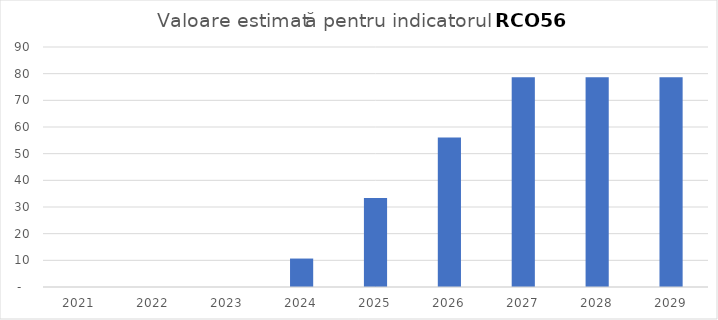
| Category | Series 0 |
|---|---|
| 2021.0 | 0 |
| 2022.0 | 0 |
| 2023.0 | 0 |
| 2024.0 | 10.67 |
| 2025.0 | 33.343 |
| 2026.0 | 56.017 |
| 2027.0 | 78.69 |
| 2028.0 | 78.69 |
| 2029.0 | 78.69 |